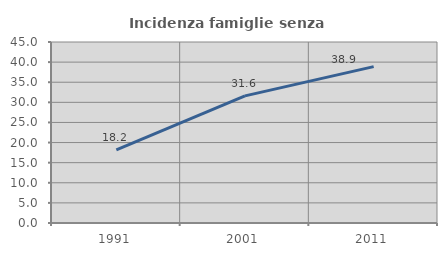
| Category | Incidenza famiglie senza nuclei |
|---|---|
| 1991.0 | 18.167 |
| 2001.0 | 31.599 |
| 2011.0 | 38.878 |